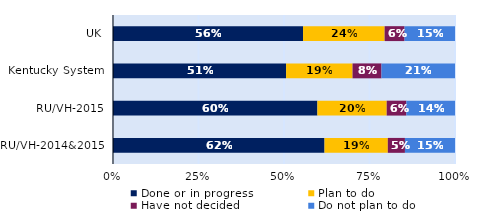
| Category | Done or in progress | Plan to do | Have not decided | Do not plan to do |
|---|---|---|---|---|
| UK | 0.556 | 0.239 | 0.058 | 0.147 |
| Kentucky System | 0.506 | 0.194 | 0.085 | 0.215 |
| RU/VH-2015 | 0.598 | 0.203 | 0.057 | 0.142 |
| RU/VH-2014&2015 | 0.618 | 0.185 | 0.05 | 0.146 |